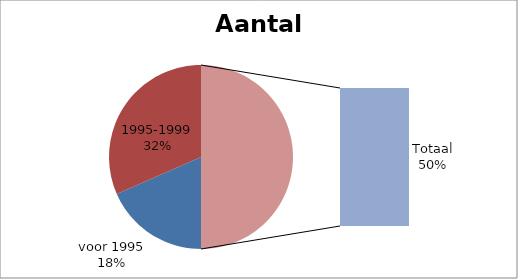
| Category | Aantal |
|---|---|
| voor 1995 | 7 |
| 1995-1999 | 12 |
| 2000-2005 | 0 |
| 2006-2008 | 0 |
| 2009 | 0 |
| 2010 | 0 |
| Totaal | 19 |